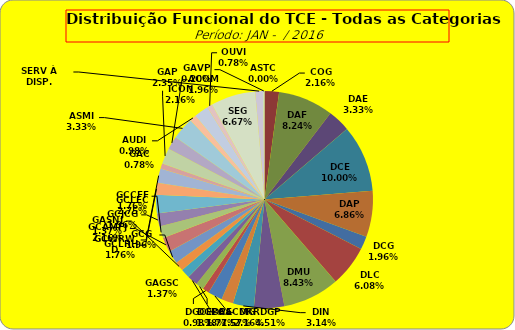
| Category | ASTC |
|---|---|
| ASTC | 0 |
| COG | 11 |
| DAF | 42 |
| DAE | 17 |
| DCE | 51 |
| DAP | 35 |
| DCG | 10 |
| DLC | 31 |
| DMU | 43 |
| DGP | 23 |
| DIN | 16 |
| DPE | 9 |
| DRR | 11 |
| DGCE | 5 |
| DGPA | 6 |
| GACMG | 8 |
| GAGSC | 7 |
| GASNI | 7 |
| GCG | 10 |
| GCAMFJ | 11 |
| GCCFF | 9 |
| GCJCG | 10 |
| GCLEC | 14 |
| GCLRH | 9 |
| GCWRWD | 11 |
| GAC | 4 |
| GAP | 12 |
| ACOM | 10 |
| ASMI | 17 |
| AUDI | 5 |
| ICON | 11 |
| OUVI | 4 |
| SEG | 34 |
| SERV À DISP. | 6 |
| GAVP | 1 |